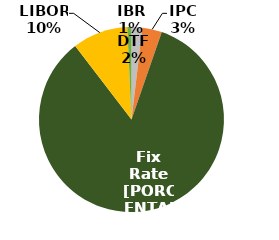
| Category | Series 0 |
|---|---|
| DTF | 0.019 |
| IPC | 0.034 |
| Tasa Fija | 0.843 |
| LIBOR | 0.097 |
| IBR | 0.007 |